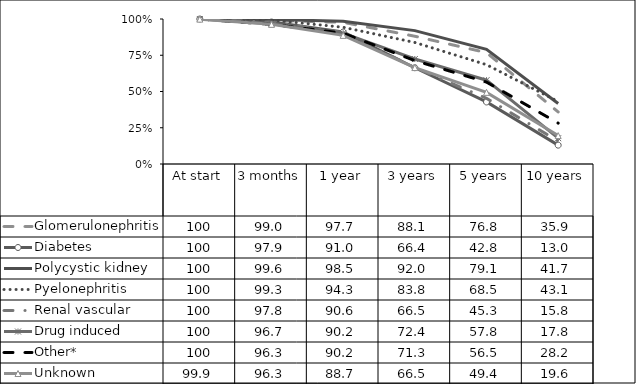
| Category | Glomerulonephritis | Diabetes | Polycystic kidney | Pyelonephritis | Renal vascular | Drug induced | Other* | Unknown |
|---|---|---|---|---|---|---|---|---|
| At start | 100 | 100 | 100 | 100 | 100 | 100 | 100 | 99.9 |
| 3 months | 99 | 97.9 | 99.6 | 99.3 | 97.8 | 96.7 | 96.3 | 96.3 |
| 1 year | 97.7 | 91 | 98.5 | 94.3 | 90.6 | 90.2 | 90.2 | 88.7 |
| 3 years | 88.1 | 66.4 | 92 | 83.8 | 66.5 | 72.4 | 71.3 | 66.5 |
| 5 years | 76.8 | 42.8 | 79.1 | 68.5 | 45.3 | 57.8 | 56.5 | 49.4 |
| 10 years | 35.9 | 13 | 41.7 | 43.1 | 15.8 | 17.8 | 28.2 | 19.6 |